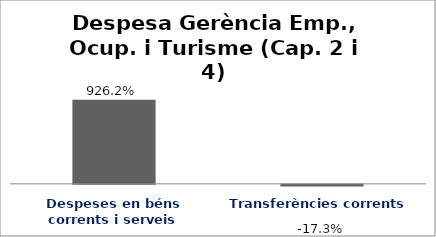
| Category | Series 0 |
|---|---|
| Despeses en béns corrents i serveis | 9.262 |
| Transferències corrents | -0.173 |